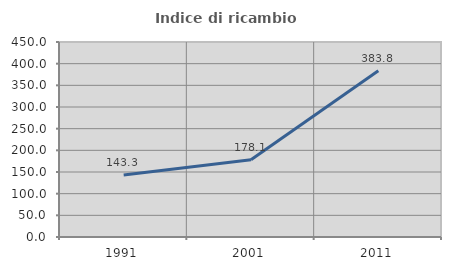
| Category | Indice di ricambio occupazionale  |
|---|---|
| 1991.0 | 143.284 |
| 2001.0 | 178.125 |
| 2011.0 | 383.784 |